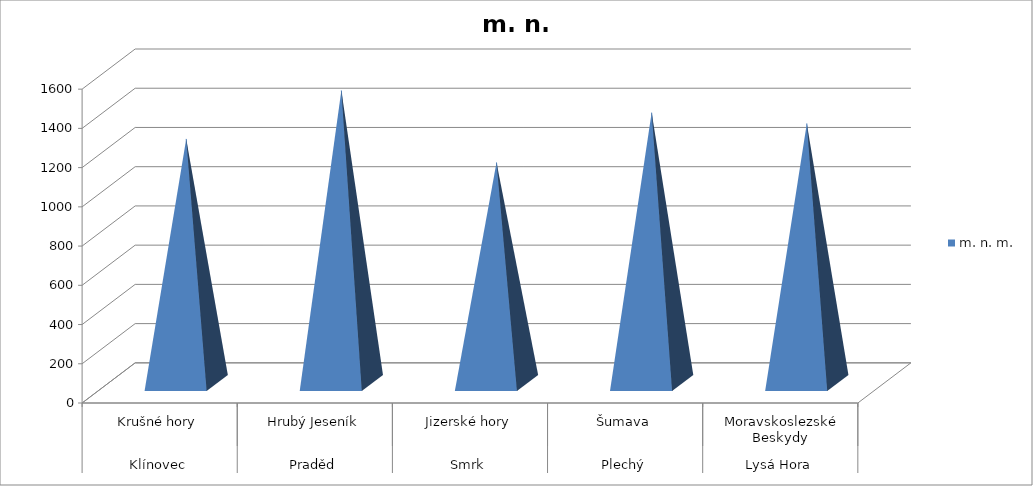
| Category | m. n. m. |
|---|---|
| 0 | 1244 |
| 1 | 1491 |
| 2 | 1124 |
| 3 | 1378 |
| 4 | 1323 |